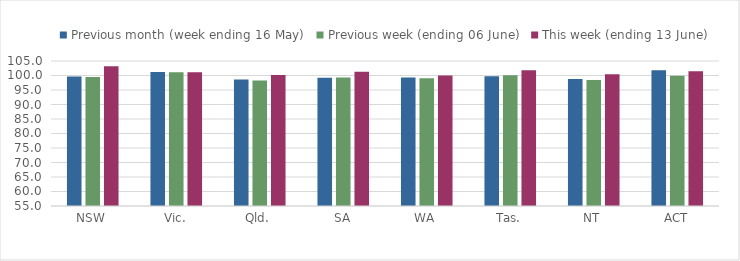
| Category | Previous month (week ending 16 May) | Previous week (ending 06 June) | This week (ending 13 June) |
|---|---|---|---|
| NSW | 99.646 | 99.45 | 103.184 |
| Vic. | 101.245 | 101.133 | 101.154 |
| Qld. | 98.619 | 98.291 | 100.213 |
| SA | 99.251 | 99.268 | 101.286 |
| WA | 99.353 | 99.03 | 99.976 |
| Tas. | 99.747 | 100.072 | 101.779 |
| NT | 98.794 | 98.423 | 100.391 |
| ACT | 101.801 | 99.894 | 101.46 |